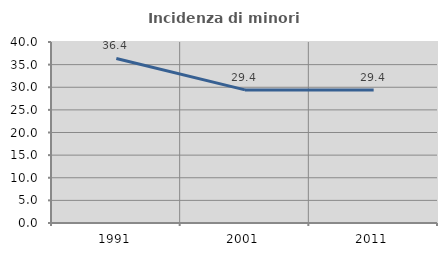
| Category | Incidenza di minori stranieri |
|---|---|
| 1991.0 | 36.364 |
| 2001.0 | 29.412 |
| 2011.0 | 29.412 |